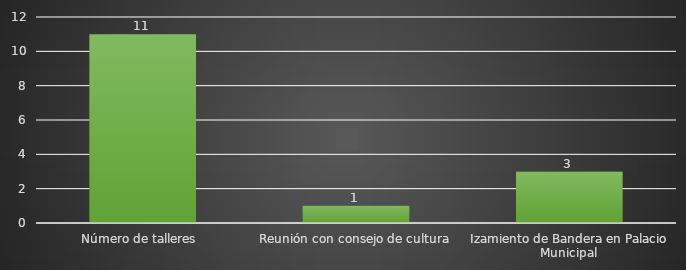
| Category | INDICADOR  |
|---|---|
| Número de talleres  | 11 |
| Reunión con consejo de cultura | 1 |
| Izamiento de Bandera en Palacio Municipal | 3 |